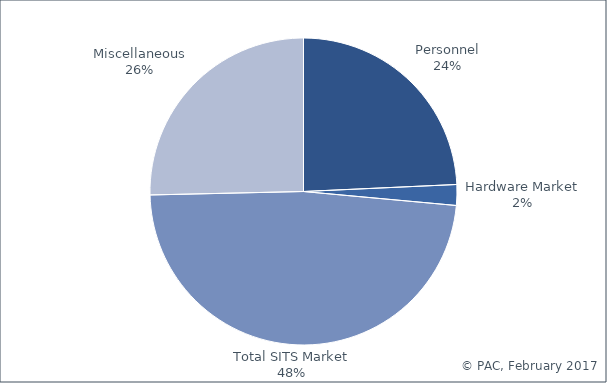
| Category | Series 0 |
|---|---|
| Personnel | 0.243 |
| Hardware Market | 0.022 |
| Total SITS Market | 0.482 |
| Miscellaneous | 0.254 |